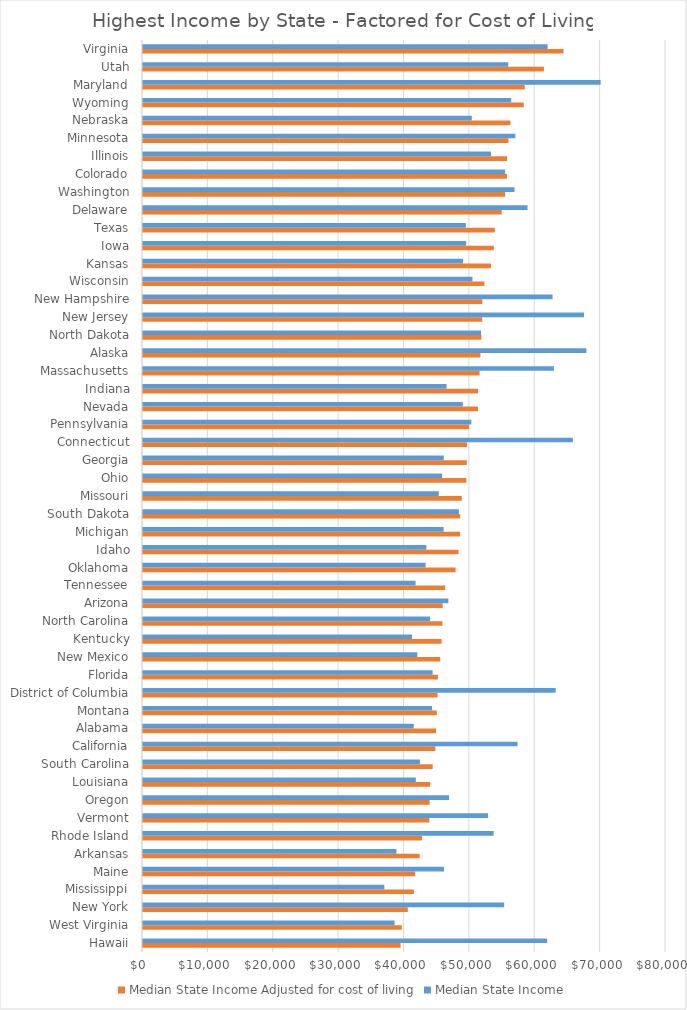
| Category | Median State Income Adjusted for cost of living | Median State Income |
|---|---|---|
| Hawaii | 39401.53 | 61821 |
| West Virginia | 39590.535 | 38482 |
| New York | 40502.933 | 55246 |
| Mississippi | 41435.466 | 36919 |
| Maine | 41621.157 | 46033 |
| Arkansas | 42312.227 | 38758 |
| Rhode Island | 42669.849 | 53636 |
| Vermont | 43797.51 | 52776 |
| Oregon | 43835.206 | 46816 |
| Louisiana | 43930.526 | 41734 |
| South Carolina | 44316.946 | 42367 |
| California | 44720.531 | 57287 |
| Alabama | 44821.429 | 41415 |
| Montana | 44941.057 | 44222 |
| District of Columbia | 45056.388 | 63124 |
| Florida | 45110.998 | 44299 |
| New Mexico | 45463.705 | 41963 |
| Kentucky | 45661.487 | 41141 |
| North Carolina | 45793.535 | 43916 |
| Arizona | 45838.077 | 46709 |
| Tennessee | 46222.838 | 41693 |
| Oklahoma | 47815.265 | 43225 |
| Idaho | 48263.92 | 43341 |
| Michigan | 48503.165 | 45981 |
| South Dakota | 48515.06 | 48321 |
| Missouri | 48757.543 | 45247 |
| Ohio | 49458.378 | 45749 |
| Georgia | 49523.143 | 46007 |
| Connecticut | 49587.481 | 65753 |
| Pennsylvania | 49878.848 | 50228 |
| Nevada | 51232.461 | 48927 |
| Indiana | 51256.071 | 46438 |
| Massachusetts | 51481.572 | 62859 |
| Alaska | 51617.199 | 67825 |
| North Dakota | 51755.756 | 51704 |
| New Jersey | 51890.769 | 67458 |
| New Hampshire | 51903.065 | 62647 |
| Wisconsin | 52222.798 | 50395 |
| Kansas | 53221.739 | 48964 |
| Iowa | 53666.667 | 49427 |
| Texas | 53803.922 | 49392 |
| Delaware | 54863.806 | 58814 |
| Washington | 55394.737 | 56835 |
| Colorado | 55665.327 | 55387 |
| Illinois | 55684.1 | 53234 |
| Minnesota | 55892.051 | 56954 |
| Nebraska | 56196.648 | 50296 |
| Wyoming | 58244.054 | 56322 |
| Maryland | 58385.321 | 70004 |
| Utah | 61327.113 | 55869 |
| Virginia | 64326.403 | 61882 |